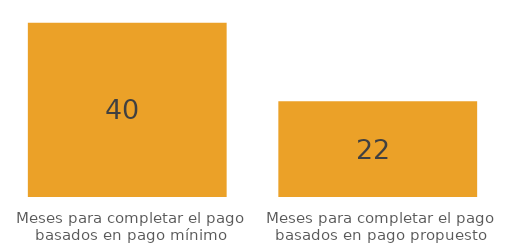
| Category | Series 0 |
|---|---|
| Meses para completar el pago basados en pago mínimo | 40 |
| Meses para completar el pago basados en pago propuesto | 22 |